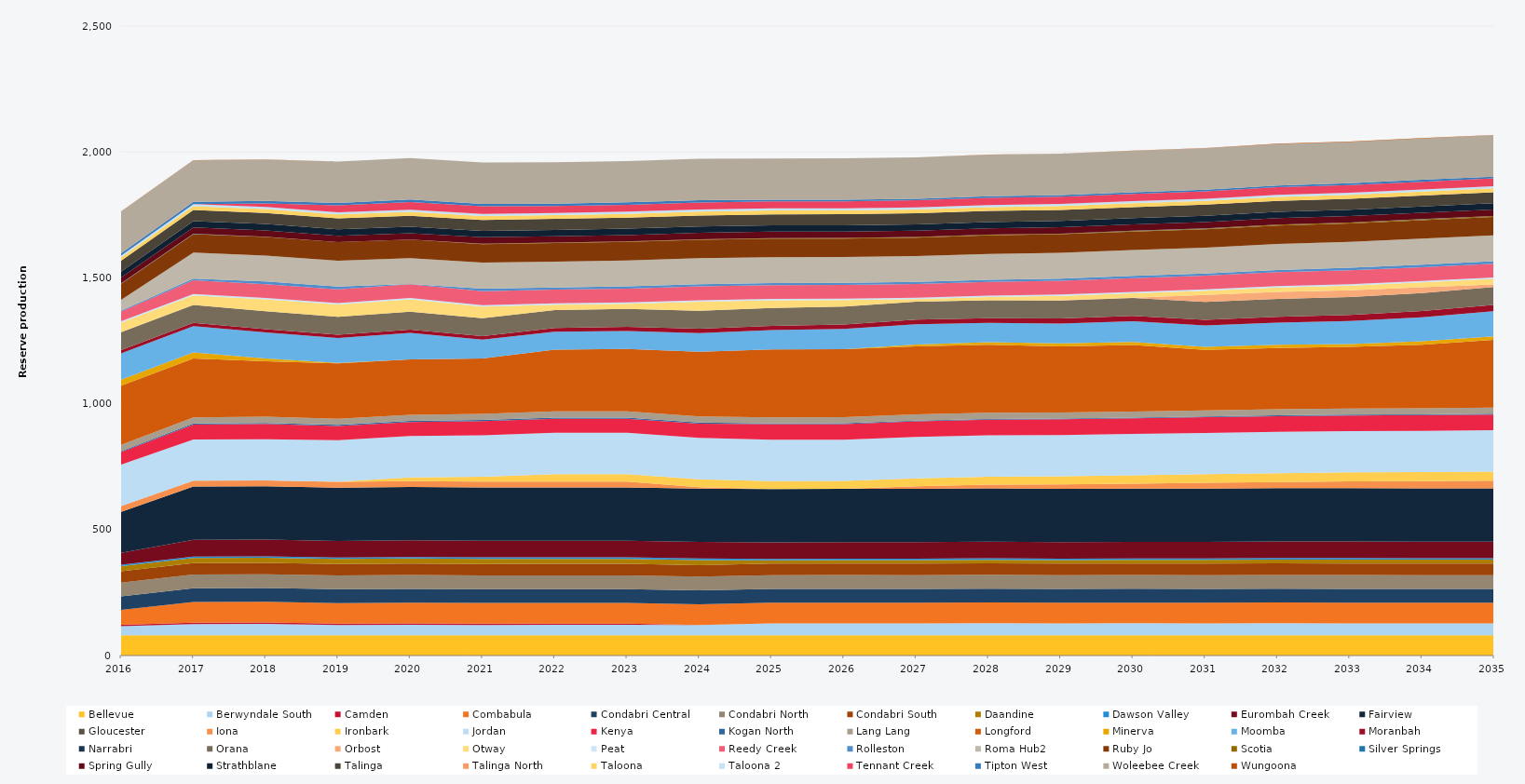
| Category | Bellevue | Berwyndale South | Camden | Combabula | Condabri Central | Condabri North | Condabri South | Daandine | Dawson Valley | Eurombah Creek | Fairview | Gloucester | Iona | Ironbark | Jordan | Kenya | Kogan North | Lang Lang | Longford | Minerva | Moomba | Moranbah | Narrabri | Orana | Orbost | Otway | Peat | Reedy Creek | Rolleston | Roma Hub2 | Ruby Jo | Scotia | Silver Springs | Spring Gully | Strathblane | Talinga | Talinga North | Taloona | Taloona 2 | Tennant Creek | Tipton West | Woleebee Creek | Wungoona |
|---|---|---|---|---|---|---|---|---|---|---|---|---|---|---|---|---|---|---|---|---|---|---|---|---|---|---|---|---|---|---|---|---|---|---|---|---|---|---|---|---|---|---|---|
| 2016 | 80.52 | 36.334 | 5 | 58.922 | 54.322 | 54.559 | 45.028 | 20.13 | 5.856 | 46.814 | 162.831 | 0 | 23.12 | 0 | 164.7 | 49.609 | 4.392 | 24.522 | 235.041 | 23.79 | 105 | 12.859 | 0 | 70.544 | 0 | 38 | 5.49 | 38.779 | 3.83 | 42.67 | 64.014 | 1.196 | 0.527 | 23.077 | 22.982 | 43.28 | 0 | 13.451 | 7.346 | 0 | 9.516 | 164.7 | 1.254 |
| 2017 | 80.3 | 44.908 | 5 | 82.125 | 54.75 | 54.75 | 45.625 | 20.075 | 5.84 | 65.7 | 211.7 | 0 | 23.12 | 0 | 164.25 | 59.186 | 4.38 | 24.455 | 233.682 | 23.725 | 105 | 12.863 | 0 | 71.175 | 0 | 38 | 5.475 | 54.75 | 6.201 | 102.93 | 73.702 | 1.079 | 0.277 | 25.185 | 25.185 | 43.8 | 0 | 15.33 | 8.395 | 0 | 9.49 | 164.25 | 0.561 |
| 2018 | 80.3 | 45.858 | 5 | 82.125 | 54.75 | 54.75 | 45.625 | 20.075 | 5.84 | 65.7 | 211.7 | 0 | 23.12 | 0 | 164.25 | 60.508 | 4.38 | 24.455 | 220 | 11.236 | 103.781 | 13.029 | 0 | 71.175 | 0 | 46.751 | 5.475 | 54.75 | 10.853 | 102.93 | 73.702 | 1.009 | 0.265 | 25.185 | 25.185 | 43.8 | 0 | 15.33 | 8.395 | 14.512 | 9.49 | 164.25 | 0.83 |
| 2019 | 80.3 | 40.964 | 5 | 82.125 | 54.75 | 54.75 | 45.625 | 20.075 | 5.84 | 65.7 | 211.7 | 0 | 23.12 | 1.088 | 164.25 | 56.245 | 4.38 | 24.455 | 220 | 1.999 | 99.088 | 12.796 | 0 | 71.175 | 0 | 48.95 | 5.475 | 54.75 | 10.948 | 102.93 | 73.702 | 0.059 | 0 | 25.185 | 25.185 | 43.8 | 0 | 15.33 | 8.395 | 28.083 | 9.49 | 164.25 | 0 |
| 2020 | 80.52 | 41.926 | 5 | 82.35 | 54.9 | 54.9 | 45.75 | 20.13 | 5.856 | 65.88 | 212.28 | 0 | 23.12 | 14.318 | 164.7 | 55.722 | 4.392 | 24.522 | 220 | 0 | 105 | 12.768 | 0 | 71.37 | 0 | 48.87 | 5.49 | 54.9 | 0.539 | 103.212 | 73.873 | 0.03 | 0 | 25.254 | 25.254 | 43.92 | 0 | 15.372 | 8.418 | 30.881 | 9.516 | 164.7 | 0 |
| 2021 | 80.3 | 41.253 | 5 | 82.125 | 54.75 | 54.75 | 45.625 | 20.075 | 5.84 | 65.7 | 211.7 | 0 | 23.12 | 19.943 | 164.25 | 56.416 | 4.38 | 24.455 | 220 | 0 | 75.033 | 13.526 | 0 | 71.175 | 0 | 46.879 | 5.475 | 54.75 | 10.851 | 102.93 | 73.674 | 1.899 | 0 | 25.185 | 25.185 | 43.8 | 0 | 15.33 | 8.395 | 30.387 | 9.49 | 164.25 | 0 |
| 2022 | 80.3 | 41.331 | 5 | 82.125 | 54.75 | 54.75 | 45.625 | 20.075 | 5.84 | 65.7 | 211.7 | 0 | 23.12 | 30.17 | 164.25 | 55.884 | 4.38 | 24.455 | 245.44 | 0 | 71.044 | 15.305 | 0 | 71.175 | 0 | 20.872 | 5.475 | 54.75 | 8.14 | 102.93 | 73.63 | 1.838 | 0 | 25.185 | 25.185 | 43.8 | 0 | 15.33 | 8.395 | 27.517 | 9.49 | 164.25 | 0 |
| 2023 | 80.3 | 41.379 | 5 | 82.125 | 54.75 | 54.75 | 45.625 | 20.075 | 5.84 | 65.7 | 211.7 | 0 | 23.12 | 30.17 | 164.25 | 55.861 | 4.38 | 24.455 | 248.107 | 0 | 71.359 | 16.282 | 0 | 71.175 | 0 | 20.537 | 5.475 | 54.75 | 9.127 | 102.93 | 73.586 | 2.003 | 0 | 25.185 | 25.185 | 43.8 | 0 | 15.33 | 8.395 | 27.672 | 9.49 | 164.25 | 0 |
| 2024 | 80.52 | 40.738 | 0 | 82.35 | 54.9 | 54.9 | 45.75 | 20.13 | 5.856 | 65.88 | 212.28 | 0 | 5.3 | 31.066 | 164.7 | 56.262 | 4.392 | 24.522 | 256.838 | 0 | 74.572 | 16.806 | 0 | 71.37 | 0 | 36.561 | 5.49 | 54.9 | 8.52 | 103.212 | 73.713 | 1.875 | 0 | 25.254 | 25.254 | 43.92 | 0 | 15.372 | 8.418 | 27.367 | 9.516 | 164.7 | 0 |
| 2025 | 80.3 | 47.499 | 0 | 82.125 | 54.75 | 54.75 | 45.625 | 12.907 | 5.84 | 65.7 | 211.7 | 0 | 0 | 31.407 | 164.25 | 61.997 | 2.774 | 24.455 | 270 | 0 | 76.162 | 17.285 | 0 | 71.175 | 0 | 30.02 | 5.475 | 54.75 | 8.423 | 102.93 | 73.498 | 2.176 | 0.034 | 25.185 | 25.185 | 43.8 | 0 | 15.33 | 8.395 | 27.579 | 6.397 | 164.25 | 0.063 |
| 2026 | 80.3 | 47.6 | 0 | 82.125 | 54.75 | 54.75 | 45.625 | 13.631 | 5.84 | 65.7 | 211.7 | 0 | 0 | 31.209 | 164.25 | 61.899 | 2.871 | 24.455 | 270 | 0 | 80.499 | 17.534 | 0 | 71.175 | 0 | 26.167 | 5.475 | 54.75 | 7.608 | 102.93 | 73.455 | 2.074 | 0.049 | 25.185 | 25.185 | 43.8 | 0 | 15.33 | 8.395 | 27.77 | 6.373 | 164.25 | 0.063 |
| 2027 | 80.3 | 47.19 | 0 | 82.125 | 54.75 | 54.75 | 45.625 | 14.055 | 5.84 | 65.7 | 211.7 | 0 | 10.378 | 31.251 | 164.25 | 62.293 | 2.931 | 24.455 | 270 | 7.49 | 80.561 | 18.159 | 0 | 71.175 | 0 | 10.64 | 5.475 | 54.75 | 7.817 | 102.93 | 73.411 | 2.237 | 0.061 | 25.185 | 25.185 | 43.8 | 0 | 15.33 | 8.395 | 27.987 | 6.182 | 164.25 | 0.118 |
| 2028 | 80.52 | 48.038 | 0 | 82.35 | 54.9 | 54.9 | 45.75 | 13.704 | 5.856 | 65.88 | 212.28 | 0 | 14.328 | 31.585 | 164.7 | 61.74 | 3.084 | 24.522 | 270 | 10.229 | 76.561 | 19.008 | 0 | 71.37 | 0 | 12.622 | 5.49 | 54.9 | 7.771 | 103.212 | 73.537 | 2.346 | 0.061 | 25.254 | 25.254 | 43.92 | 0 | 15.372 | 8.418 | 28.197 | 6.725 | 164.7 | 0.128 |
| 2029 | 80.3 | 47.439 | 0 | 82.125 | 54.75 | 54.75 | 45.625 | 14.023 | 5.84 | 65.7 | 211.7 | 0 | 17.562 | 31.889 | 164.25 | 62.06 | 2.863 | 24.455 | 262.044 | 12.04 | 79.357 | 20.36 | 0 | 71.175 | 0.638 | 17.262 | 5.475 | 54.75 | 8.523 | 102.93 | 73.323 | 2.28 | 0.264 | 25.185 | 25.185 | 43.8 | 0 | 15.33 | 8.395 | 28.519 | 6.511 | 164.25 | 0.795 |
| 2030 | 80.3 | 47.82 | 0 | 82.125 | 54.75 | 54.75 | 45.625 | 14.237 | 5.84 | 65.7 | 211.7 | 0 | 19.902 | 33.138 | 164.25 | 61.68 | 2.925 | 24.455 | 264.56 | 11.334 | 82.324 | 21.622 | 0 | 71.175 | 0.73 | 17.617 | 5.475 | 54.75 | 8.8 | 102.93 | 73.279 | 2.663 | 0.446 | 25.185 | 25.185 | 43.8 | 0 | 15.33 | 8.395 | 28.91 | 6.482 | 164.25 | 0.96 |
| 2031 | 80.3 | 47.315 | 0 | 82.125 | 54.75 | 54.75 | 45.625 | 14.686 | 5.84 | 65.7 | 211.7 | 0 | 22.963 | 34.272 | 164.25 | 62.18 | 3.051 | 24.455 | 240.213 | 11.361 | 85.103 | 22.567 | 0 | 71.175 | 27.375 | 16.659 | 5.475 | 54.75 | 8.158 | 102.93 | 73.235 | 2.938 | 0.407 | 25.185 | 25.185 | 43.8 | 0 | 15.33 | 8.395 | 29.222 | 6.473 | 164.25 | 0.975 |
| 2032 | 80.52 | 47.609 | 0 | 82.35 | 54.9 | 54.9 | 45.75 | 15.154 | 5.856 | 65.88 | 212.28 | 0 | 23.319 | 35.168 | 164.7 | 62.18 | 3.168 | 24.522 | 242.999 | 12.811 | 87.956 | 23.484 | 0 | 71.37 | 27.45 | 17.615 | 5.49 | 54.9 | 8.964 | 103.212 | 73.361 | 3.208 | 0.48 | 25.254 | 25.254 | 43.92 | 0 | 15.372 | 8.418 | 30.12 | 6.988 | 164.7 | 1.244 |
| 2033 | 80.3 | 47.65 | 0 | 82.125 | 54.75 | 54.75 | 45.625 | 16.048 | 5.84 | 65.7 | 211.7 | 0 | 27.139 | 35.704 | 164.25 | 61.838 | 3.368 | 24.455 | 244.508 | 11.624 | 90.925 | 23.992 | 0 | 71.175 | 27.375 | 18.672 | 5.475 | 54.75 | 10.167 | 102.93 | 73.147 | 3.539 | 0.609 | 25.185 | 25.185 | 43.8 | 0 | 15.33 | 8.395 | 30.603 | 6.909 | 164.25 | 1.449 |
| 2034 | 80.3 | 47.42 | 0 | 82.125 | 54.75 | 54.75 | 45.625 | 15.887 | 5.84 | 65.7 | 211.7 | 0 | 28.379 | 35.88 | 164.25 | 62.071 | 3.2 | 24.455 | 252.337 | 13.266 | 95.625 | 24.563 | 0 | 71.175 | 22.915 | 19.823 | 5.475 | 54.75 | 10.48 | 102.93 | 73.103 | 3.726 | 0.624 | 25.185 | 25.185 | 43.8 | 0 | 15.33 | 8.395 | 30.906 | 7.424 | 164.25 | 1.474 |
| 2035 | 80.3 | 47.24 | 0 | 82.125 | 54.75 | 54.75 | 45.625 | 16.121 | 5.84 | 65.7 | 211.7 | 0 | 30.261 | 35.992 | 164.25 | 62.26 | 3.281 | 24.455 | 269.427 | 13.999 | 99.532 | 24.813 | 0 | 71.175 | 10.029 | 22.13 | 5.475 | 54.75 | 10.513 | 102.93 | 72.753 | 3.21 | 0.611 | 25.185 | 25.185 | 43.8 | 0 | 15.33 | 8.395 | 31.375 | 7.024 | 164.25 | 1.358 |